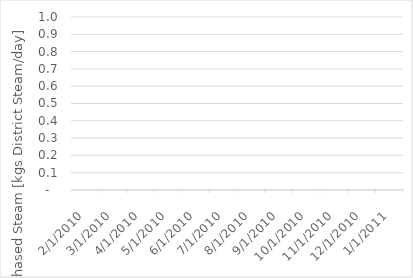
| Category | Series 0 |
|---|---|
| 2/1/10 | 0 |
| 3/1/10 | 0 |
| 4/1/10 | 0 |
| 5/1/10 | 0 |
| 6/1/10 | 0 |
| 7/1/10 | 0 |
| 8/1/10 | 0 |
| 9/1/10 | 0 |
| 10/1/10 | 0 |
| 11/1/10 | 0 |
| 12/1/10 | 0 |
| 1/1/11 | 0 |